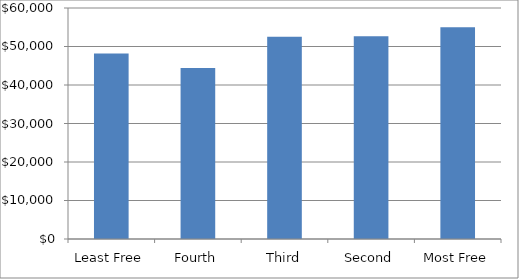
| Category | Series 0 |
|---|---|
| Least Free | 48208.651 |
| Fourth | 44440.408 |
| Third | 52517.257 |
| Second | 52631.678 |
| Most Free | 55027.608 |